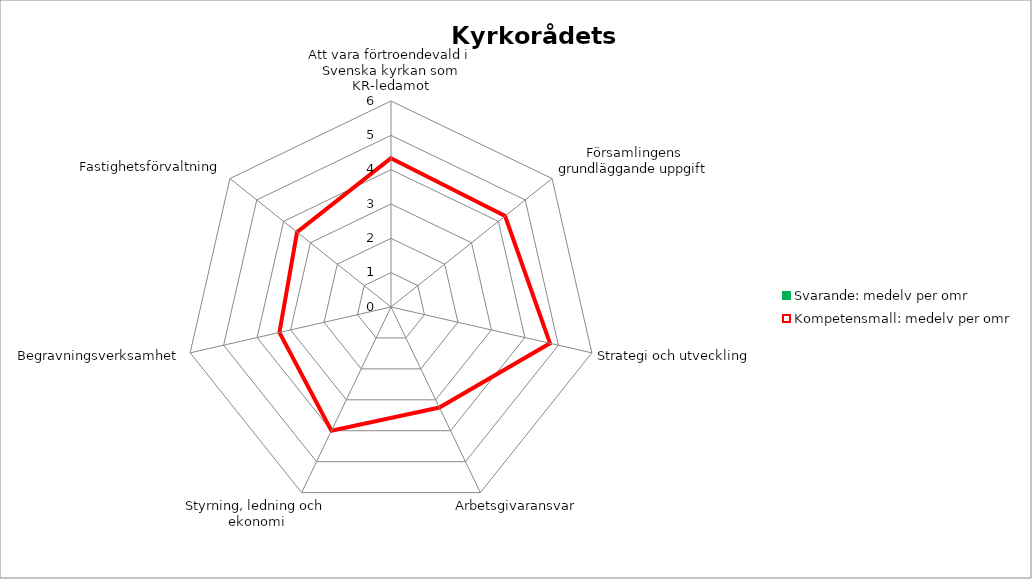
| Category | Svarande: medelv per omr | Kompetensmall: medelv per omr |
|---|---|---|
| Att vara förtroendevald i Svenska kyrkan som KR-ledamot | 0 | 4.333 |
| Församlingens grundläggande uppgift | 0 | 4.25 |
| Strategi och utveckling | 0 | 4.75 |
| Arbetsgivaransvar | 0 | 3.25 |
| Styrning, ledning och ekonomi | 0 | 4 |
| Begravningsverksamhet | 0 | 3.333 |
| Fastighetsförvaltning | 0 | 3.5 |